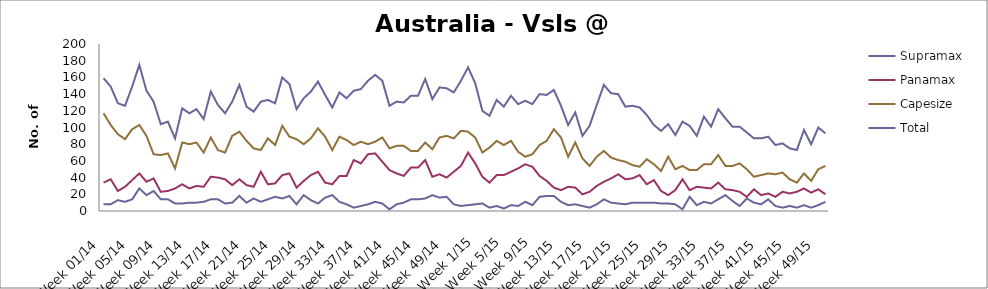
| Category | Supramax | Panamax | Capesize | Total |
|---|---|---|---|---|
| Week 01/14 | 8 | 34 | 117 | 159 |
| Week 02/14 | 8 | 38 | 103 | 149 |
| Week 03/14 | 13 | 24 | 92 | 129 |
| Week 04/14 | 11 | 29 | 86 | 126 |
| Week 05/14 | 14 | 37 | 98 | 149 |
| Week 06/14 | 27 | 45 | 103 | 175 |
| Week 07/14 | 19 | 35 | 90 | 144 |
| Week 08/14 | 24 | 39 | 68 | 131 |
| Week 09/14 | 14 | 23 | 67 | 104 |
| Week 10/14 | 14 | 24 | 69 | 107 |
| Week 11/14 | 9 | 27 | 51 | 87 |
| Week 12/14 | 9 | 32 | 82 | 123 |
| Week 13/14 | 10 | 27 | 80 | 117 |
| Week 14/14 | 10 | 30 | 82 | 122 |
| Week 15/14 | 11 | 29 | 70 | 110 |
| Week 16/14 | 14 | 41 | 88 | 143 |
| Week 17/14 | 14 | 40 | 73 | 127 |
| Week 18/14 | 9 | 38 | 70 | 117 |
| Week 19/14 | 10 | 31 | 90 | 131 |
| Week 20/14 | 18 | 38 | 95 | 151 |
| Week 21/14 | 10 | 31 | 84 | 125 |
| Week 22/14 | 15 | 29 | 75 | 119 |
| Week 23/14 | 11 | 47 | 73 | 131 |
| Week 24/14 | 14 | 32 | 87 | 133 |
| Week 25/14 | 17 | 33 | 79 | 129 |
| Week 26/14 | 15 | 43 | 102 | 160 |
| Week 27/14 | 18 | 45 | 89 | 152 |
| Week 28/14 | 8 | 28 | 86 | 122 |
| Week 29/14 | 19 | 36 | 80 | 135 |
| Week 30/14 | 13 | 43 | 87 | 143 |
| Week 31/14 | 9 | 47 | 99 | 155 |
| Week 32/14 | 16 | 34 | 89 | 139 |
| Week 33/14 | 19 | 32 | 73 | 124 |
| Week 34/14 | 11 | 42 | 89 | 142 |
| Week 35/14 | 8 | 42 | 85 | 135 |
| Week 36/14 | 4 | 61 | 79 | 144 |
| Week 37/14 | 6 | 57 | 83 | 146 |
| Week 38/14 | 8 | 68 | 80 | 156 |
| Week 39/14 | 11 | 69 | 83 | 163 |
| Week 40/14 | 9 | 59 | 88 | 156 |
| Week 41/14 | 2 | 49 | 75 | 126 |
| Week 42/14 | 8 | 45 | 78 | 131 |
| Week 43/14 | 10 | 42 | 78 | 130 |
| Week 44/14 | 14 | 52 | 72 | 138 |
| Week 45/14 | 14 | 52 | 72 | 138 |
| Week 46/14 | 15 | 61 | 82 | 158 |
| Week 47/14 | 19 | 41 | 74 | 134 |
| Week 48/14 | 16 | 44 | 88 | 148 |
| Week 49/14 | 17 | 40 | 90 | 147 |
| Week 50/14 | 8 | 47 | 87 | 142 |
| Week 51/14 | 6 | 54 | 96 | 156 |
| Week 52/14 | 7 | 70 | 95 | 172 |
| Week 1/15 | 8 | 57 | 88 | 153 |
| Week 2/15 | 9 | 41 | 70 | 120 |
| Week 3/15 | 4 | 34 | 76 | 114 |
| Week 4/15 | 6 | 43 | 84 | 133 |
| Week 5/15 | 3 | 43 | 79 | 125 |
| Week 6/15 | 7 | 47 | 84 | 138 |
| Week 7/15 | 6 | 51 | 71 | 128 |
| Week 8/15 | 11 | 56 | 65 | 132 |
| Week 9/15 | 7 | 53 | 68 | 128 |
| Week 10/15 | 17 | 42 | 79 | 140 |
| Week 11/15 | 18 | 36 | 84 | 139 |
| Week 12/15 | 18 | 28 | 98 | 145 |
| Week 13/15 | 11 | 25 | 88 | 126 |
| Week 14/15 | 7 | 29 | 65 | 103 |
| Week 15/15 | 8 | 28 | 82 | 118 |
| Week 16/15 | 6 | 20 | 63 | 90 |
| Week 17/15 | 4 | 23 | 54 | 102 |
| Week 18/15 | 8 | 30 | 65 | 127 |
| Week 19/15 | 14 | 35 | 72 | 151 |
| Week 20/15 | 10 | 39 | 64 | 141 |
| Week 21/15 | 9 | 44 | 61 | 140 |
| Week 22/15 | 8 | 38 | 59 | 125 |
| Week 23/15 | 10 | 39 | 55 | 126 |
| Week 24/15 | 10 | 43 | 53 | 124 |
| Week 25/15 | 10 | 32 | 62 | 115 |
| Week 26/15 | 10 | 37 | 56 | 103 |
| Week 27/15 | 9 | 24 | 48 | 96 |
| Week 28/15 | 9 | 19 | 65 | 104 |
| Week 29/15 | 8 | 25 | 50 | 91 |
| Week 30/15 | 2 | 38 | 54 | 107 |
| Week 31/15 | 17 | 25 | 49 | 102 |
| Week 32/15 | 7 | 29 | 49 | 90 |
| Week 33/15 | 11 | 28 | 56 | 113 |
| Week 34/15 | 9 | 27 | 56 | 101 |
| Week 35/15 | 14 | 34 | 67 | 122 |
| Week 36/15 | 19 | 26 | 54 | 111 |
| Week 37/15 | 12 | 25 | 54 | 101 |
| Week 38/15 | 6 | 23 | 57 | 101 |
| Week 39/15 | 15 | 17 | 50 | 94 |
| Week 40/15 | 10 | 26 | 41 | 87 |
| Week 41/15 | 8 | 19 | 43 | 87 |
| Week 42/15 | 14 | 21 | 45 | 89 |
| Week 43/15 | 6 | 17 | 44 | 79 |
| Week 44/15 | 4 | 23 | 46 | 81 |
| Week 45/15 | 6 | 21 | 38 | 75 |
| Week 46/15 | 4 | 23 | 34 | 73 |
| Week 47/15 | 7 | 27 | 45 | 97 |
| Week 48/15 | 4 | 22 | 36 | 80 |
| Week 49/15 | 7 | 26 | 50 | 100 |
| Week 50/15 | 11 | 20 | 54 | 93 |